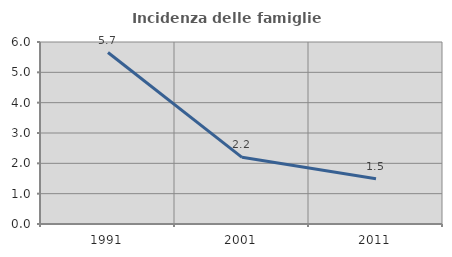
| Category | Incidenza delle famiglie numerose |
|---|---|
| 1991.0 | 5.653 |
| 2001.0 | 2.198 |
| 2011.0 | 1.492 |